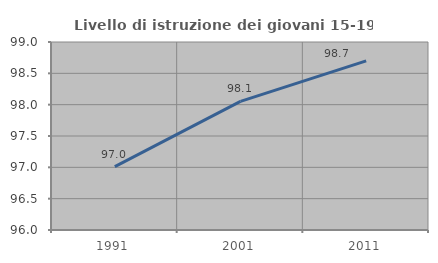
| Category | Livello di istruzione dei giovani 15-19 anni |
|---|---|
| 1991.0 | 97.012 |
| 2001.0 | 98.052 |
| 2011.0 | 98.698 |